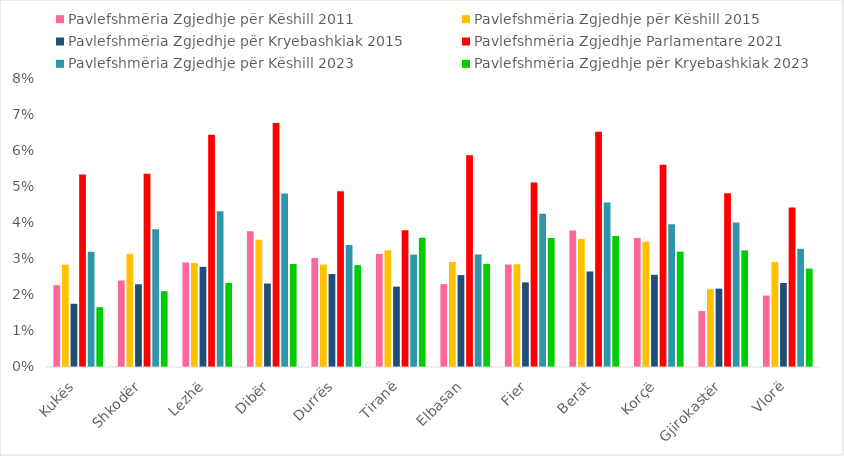
| Category | Pavlefshmëria Zgjedhje për Këshill 2011 | Pavlefshmëria Zgjedhje për Këshill 2015 | Pavlefshmëria Zgjedhje për Kryebashkiak 2015 | Pavlefshmëria Zgjedhje Parlamentare 2021 | Pavlefshmëria Zgjedhje për Këshill 2023 | Pavlefshmëria Zgjedhje për Kryebashkiak 2023 |
|---|---|---|---|---|---|---|
| Kukës | 0.023 | 0.028 | 0.018 | 0.054 | 0.032 | 0.017 |
| Shkodër | 0.024 | 0.031 | 0.023 | 0.054 | 0.038 | 0.021 |
| Lezhë | 0.029 | 0.029 | 0.028 | 0.065 | 0.043 | 0.023 |
| Dibër | 0.038 | 0.035 | 0.023 | 0.068 | 0.048 | 0.029 |
| Durrës | 0.03 | 0.028 | 0.026 | 0.049 | 0.034 | 0.028 |
| Tiranë | 0.031 | 0.032 | 0.022 | 0.038 | 0.031 | 0.036 |
| Elbasan | 0.023 | 0.029 | 0.026 | 0.059 | 0.031 | 0.029 |
| Fier | 0.028 | 0.029 | 0.024 | 0.051 | 0.043 | 0.036 |
| Berat | 0.038 | 0.036 | 0.027 | 0.065 | 0.046 | 0.036 |
| Korçë | 0.036 | 0.035 | 0.026 | 0.056 | 0.04 | 0.032 |
| Gjirokastër | 0.016 | 0.022 | 0.022 | 0.048 | 0.04 | 0.032 |
| Vlorë | 0.02 | 0.029 | 0.023 | 0.044 | 0.033 | 0.027 |